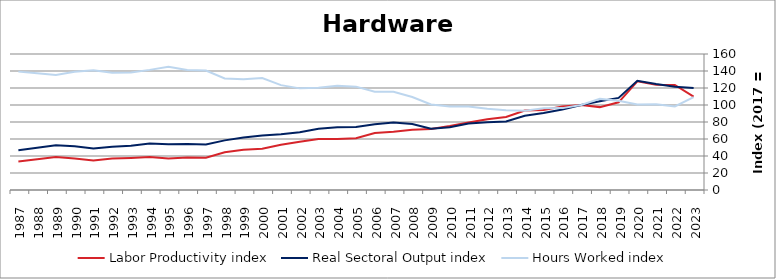
| Category | Labor Productivity index | Real Sectoral Output index | Hours Worked index |
|---|---|---|---|
| 2023.0 | 109.901 | 120.124 | 109.302 |
| 2022.0 | 123.553 | 121.473 | 98.316 |
| 2021.0 | 123.757 | 124.761 | 100.812 |
| 2020.0 | 127.779 | 128.588 | 100.633 |
| 2019.0 | 103.142 | 108.386 | 105.084 |
| 2018.0 | 97.511 | 104.529 | 107.197 |
| 2017.0 | 100 | 100 | 100 |
| 2016.0 | 98.187 | 94.589 | 96.335 |
| 2015.0 | 94.194 | 90.565 | 96.147 |
| 2014.0 | 93.582 | 87.331 | 93.321 |
| 2013.0 | 85.896 | 80.658 | 93.903 |
| 2012.0 | 83.277 | 79.664 | 95.661 |
| 2011.0 | 79.499 | 78.109 | 98.252 |
| 2010.0 | 75.186 | 73.852 | 98.226 |
| 2009.0 | 71.661 | 72.074 | 100.575 |
| 2008.0 | 71.008 | 77.709 | 109.437 |
| 2007.0 | 68.588 | 79.27 | 115.575 |
| 2006.0 | 66.937 | 77.401 | 115.633 |
| 2005.0 | 60.883 | 74.022 | 121.581 |
| 2004.0 | 60.03 | 73.698 | 122.768 |
| 2003.0 | 59.947 | 72.033 | 120.16 |
| 2002.0 | 56.767 | 67.879 | 119.575 |
| 2001.0 | 53.197 | 65.635 | 123.382 |
| 2000.0 | 48.619 | 64.05 | 131.738 |
| 1999.0 | 47.43 | 61.821 | 130.341 |
| 1998.0 | 44.509 | 58.38 | 131.165 |
| 1997.0 | 38.006 | 53.445 | 140.623 |
| 1996.0 | 38.307 | 54.115 | 141.265 |
| 1995.0 | 37.136 | 53.826 | 144.943 |
| 1994.0 | 38.693 | 54.686 | 141.333 |
| 1993.0 | 37.608 | 52.023 | 138.33 |
| 1992.0 | 36.965 | 51.013 | 138.004 |
| 1991.0 | 34.722 | 48.893 | 140.812 |
| 1990.0 | 36.991 | 51.417 | 139 |
| 1989.0 | 38.83 | 52.552 | 135.339 |
| 1988.0 | 36.212 | 49.737 | 137.349 |
| 1987.0 | 33.57 | 46.753 | 139.269 |